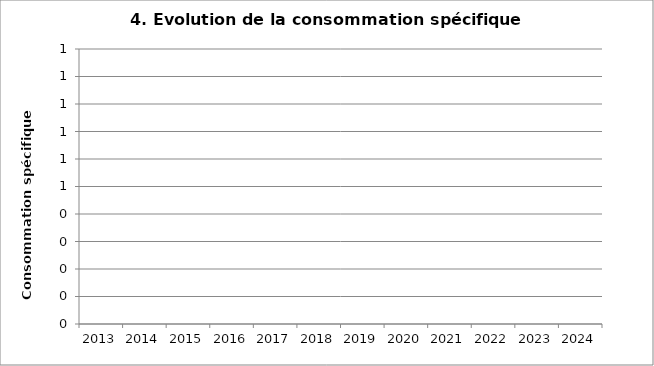
| Category | Consommation spécifique |
|---|---|
| 2013.0 | 0 |
| 2014.0 | 0 |
| 2015.0 | 0 |
| 2016.0 | 0 |
| 2017.0 | 0 |
| 2018.0 | 0 |
| 2019.0 | 0 |
| 2020.0 | 0 |
| 2021.0 | 0 |
| 2022.0 | 0 |
| 2023.0 | 0 |
| 2024.0 | 0 |